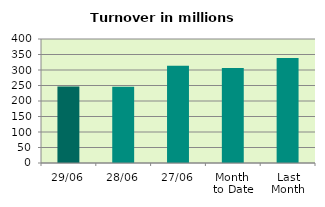
| Category | Series 0 |
|---|---|
| 29/06 | 246.441 |
| 28/06 | 246.225 |
| 27/06 | 313.658 |
| Month 
to Date | 306.507 |
| Last
Month | 338.969 |